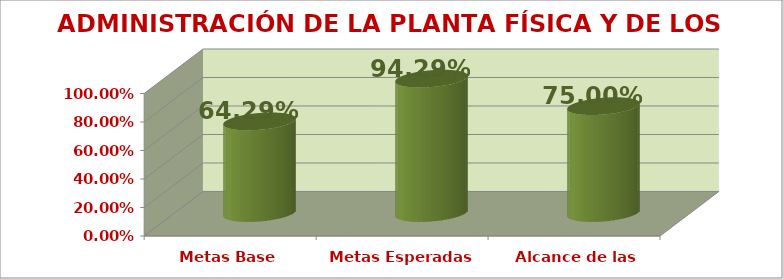
| Category | ADMINISTRACIÓN DE LA PLANTA FÍSICA Y DE LOS RECURSOS |
|---|---|
| Metas Base | 0.643 |
| Metas Esperadas | 0.943 |
| Alcance de las Metas | 0.75 |